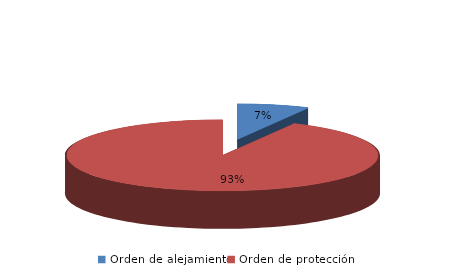
| Category | Series 0 |
|---|---|
| Orden de alejamiento | 18 |
| Orden de protección | 224 |